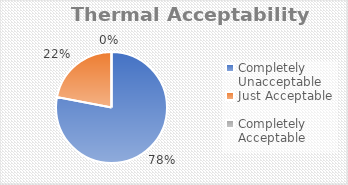
| Category | Series 0 |
|---|---|
| Completely Unacceptable | 0.78 |
| Just Acceptable | 0.22 |
| Completely Acceptable | 0 |